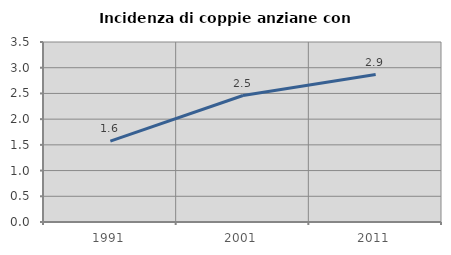
| Category | Incidenza di coppie anziane con figli |
|---|---|
| 1991.0 | 1.573 |
| 2001.0 | 2.46 |
| 2011.0 | 2.868 |